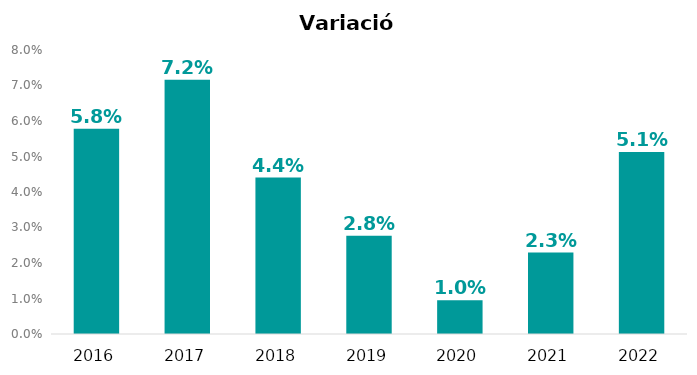
| Category | Variació interanual |
|---|---|
| 2016.0 | 0.058 |
| 2017.0 | 0.072 |
| 2018.0 | 0.044 |
| 2019.0 | 0.028 |
| 2020.0 | 0.01 |
| 2021.0 | 0.023 |
| 2022.0 | 0.051 |